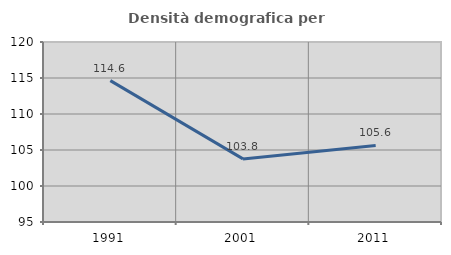
| Category | Densità demografica |
|---|---|
| 1991.0 | 114.632 |
| 2001.0 | 103.763 |
| 2011.0 | 105.631 |